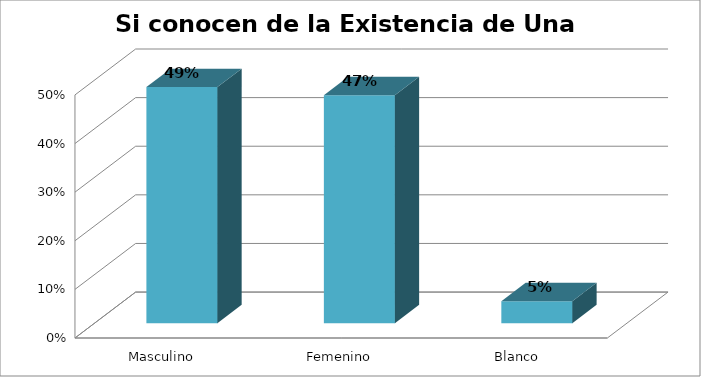
| Category | Series 0 |
|---|---|
| Masculino | 0.486 |
| Femenino | 0.469 |
| Blanco | 0.045 |